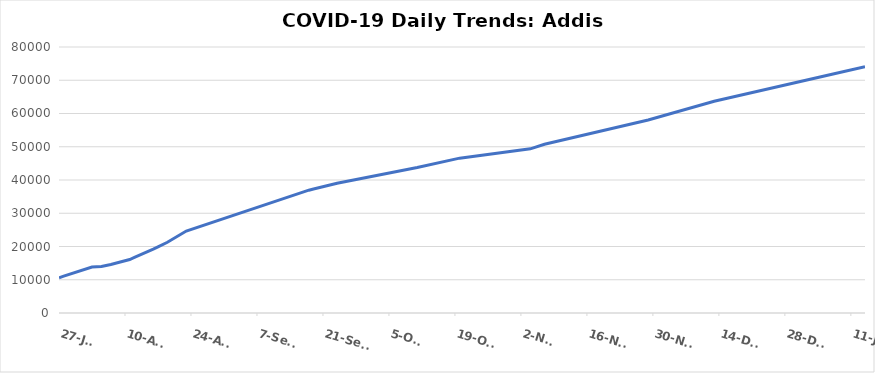
| Category | Addis Ababa |
|---|---|
| 2020-07-27 | 10583 |
| 2020-07-28 | 11076 |
| 2020-08-03 | 13826 |
| 2020-08-05 | 14005 |
| 2020-08-07 | 14607 |
| 2020-08-09 | 15352 |
| 2020-08-11 | 16086 |
| 2020-08-12 | 16698 |
| 2020-08-16 | 19207 |
| 2020-08-17 | 19881 |
| 2020-08-19 | 21266 |
| 2020-08-23 | 24659 |
| 2020-09-18 | 36939 |
| 2020-09-19 | 37278 |
| 2020-09-24 | 39012 |
| 2020-10-11 | 43749 |
| 2020-10-20 | 46570 |
| 2020-11-04 | 49377 |
| 2020-11-07 | 50749 |
| 2020-11-29 | 58046 |
| 2020-12-13 | 63667 |
| 2021-01-07 | 71781 |
| 2021-01-14 | 74056 |